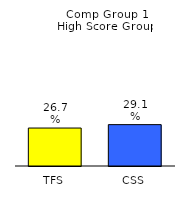
| Category | Series 0 |
|---|---|
| TFS | 0.267 |
| CSS | 0.291 |